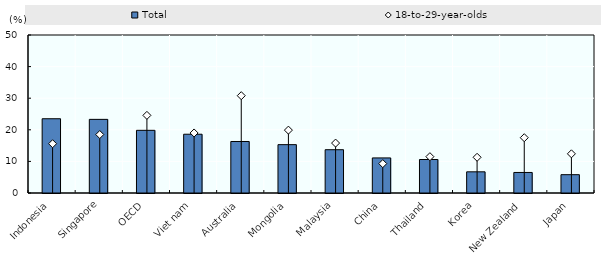
| Category | Total |
|---|---|
| Indonesia | 23.5 |
| Singapore | 23.3 |
| OECD | 19.834 |
| Viet nam | 18.6 |
| Australia | 16.3 |
| Mongolia | 15.3 |
| Malaysia | 13.7 |
| China | 11.1 |
| Thailand | 10.6 |
| Korea | 6.7 |
| New Zealand | 6.5 |
| Japan | 5.8 |